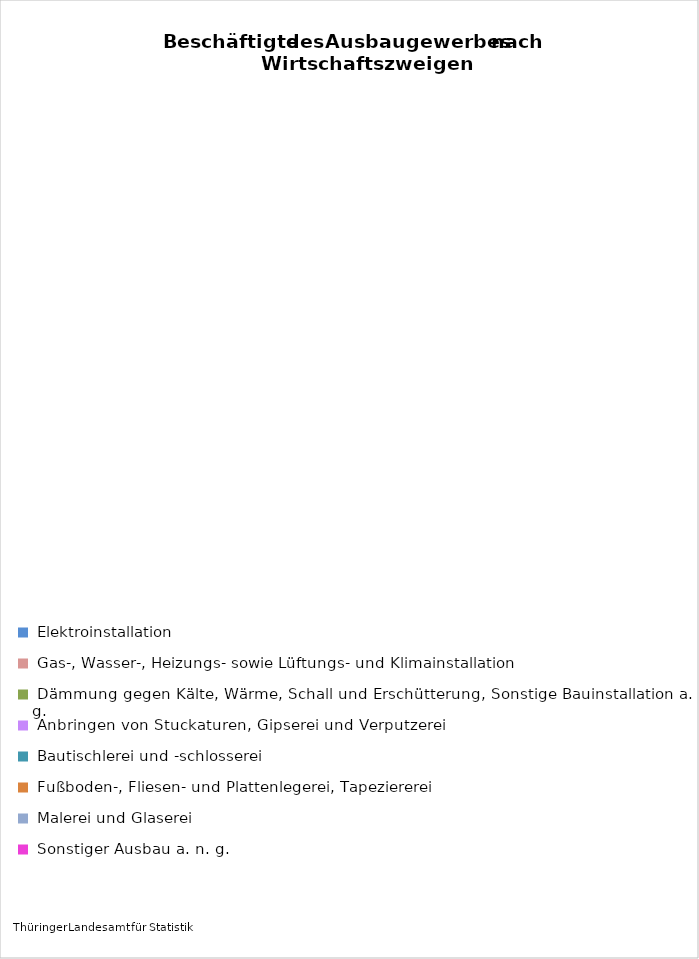
| Category | Anzahl Beschäftigte 2017 |
|---|---|
| Elektroinstallation | 5644 |
| Gas-, Wasser-, Heizungs- sowie Lüftungs- und Klimainstallation | 4121 |
| Dämmung gegen Kälte, Wärme, Schall und Erschütterung, Sonstige Bauinstallation a. n. g. | 882 |
| Anbringen von Stuckaturen, Gipserei und Verputzerei | 237 |
| Bautischlerei und -schlosserei | 1099 |
| Fußboden-, Fliesen- und Plattenlegerei, Tapeziererei | 810 |
| Malerei und Glaserei | 1837 |
| Sonstiger Ausbau a. n. g. | 86 |